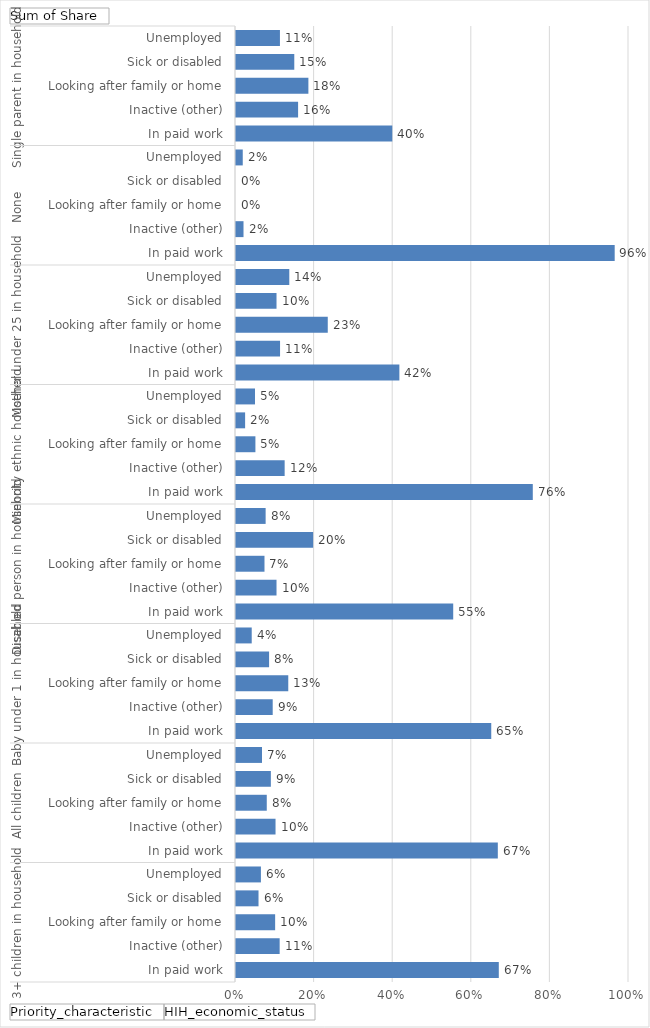
| Category | Total |
|---|---|
| 0 | 0.669 |
| 1 | 0.111 |
| 2 | 0.1 |
| 3 | 0.057 |
| 4 | 0.063 |
| 5 | 0.666 |
| 6 | 0.101 |
| 7 | 0.078 |
| 8 | 0.089 |
| 9 | 0.066 |
| 10 | 0.65 |
| 11 | 0.093 |
| 12 | 0.133 |
| 13 | 0.084 |
| 14 | 0.04 |
| 15 | 0.553 |
| 16 | 0.103 |
| 17 | 0.072 |
| 18 | 0.196 |
| 19 | 0.075 |
| 20 | 0.755 |
| 21 | 0.124 |
| 22 | 0.049 |
| 23 | 0.023 |
| 24 | 0.048 |
| 25 | 0.416 |
| 26 | 0.112 |
| 27 | 0.234 |
| 28 | 0.103 |
| 29 | 0.136 |
| 30 | 0.964 |
| 31 | 0.019 |
| 32 | 0 |
| 33 | 0 |
| 34 | 0.017 |
| 35 | 0.398 |
| 36 | 0.158 |
| 37 | 0.184 |
| 38 | 0.148 |
| 39 | 0.112 |